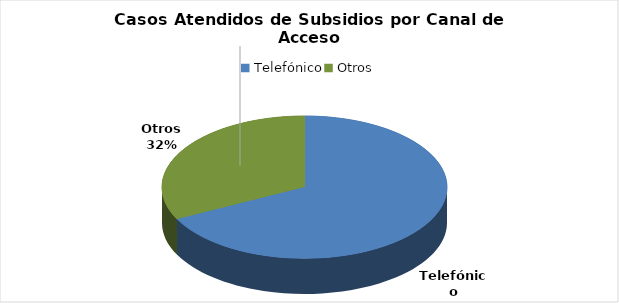
| Category | Total |
|---|---|
| Telefónico | 99933 |
| Otros | 47924 |